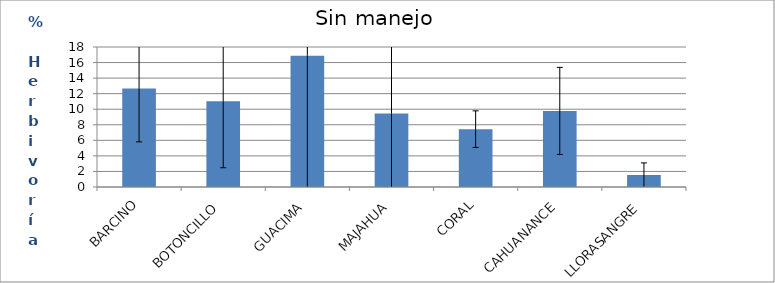
| Category | Series 0 |
|---|---|
| BARCINO | 12.674 |
| BOTONCILLO | 11.013 |
| GUACIMA | 16.886 |
| MAJAHUA | 9.439 |
| CORAL | 7.437 |
| CAHUANANCE | 9.783 |
| LLORASANGRE | 1.542 |